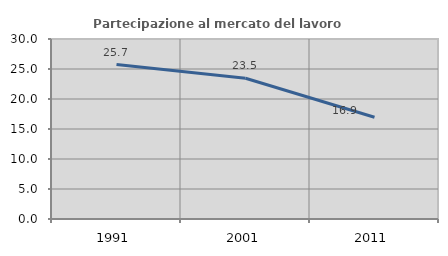
| Category | Partecipazione al mercato del lavoro  femminile |
|---|---|
| 1991.0 | 25.743 |
| 2001.0 | 23.457 |
| 2011.0 | 16.949 |